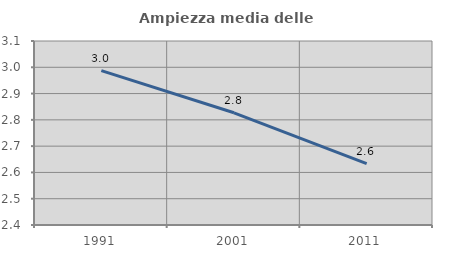
| Category | Ampiezza media delle famiglie |
|---|---|
| 1991.0 | 2.987 |
| 2001.0 | 2.827 |
| 2011.0 | 2.634 |